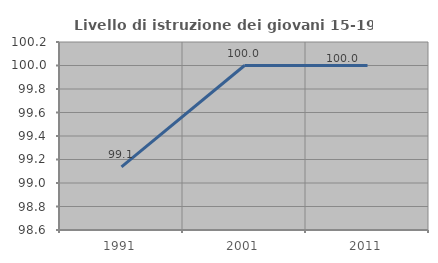
| Category | Livello di istruzione dei giovani 15-19 anni |
|---|---|
| 1991.0 | 99.138 |
| 2001.0 | 100 |
| 2011.0 | 100 |